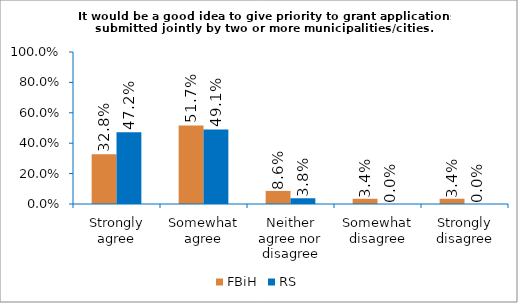
| Category | FBiH | RS |
|---|---|---|
| Strongly agree | 0.328 | 0.472 |
| Somewhat agree | 0.517 | 0.491 |
| Neither agree nor disagree | 0.086 | 0.038 |
| Somewhat disagree | 0.034 | 0 |
| Strongly disagree | 0.034 | 0 |